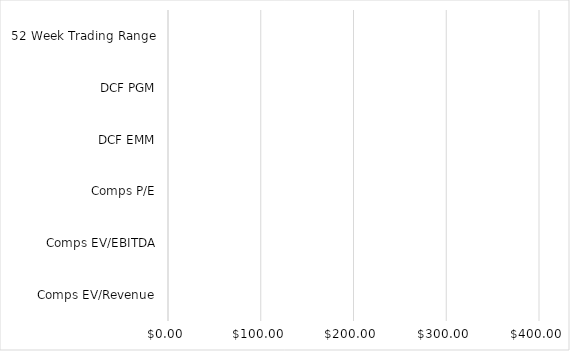
| Category | Min | Difference | Max |
|---|---|---|---|
| Comps EV/Revenue |  | 0 |  |
| Comps EV/EBITDA |  | 0 |  |
| Comps P/E |  | 0 |  |
| DCF EMM |  | 0 |  |
| DCF PGM |  | 0 |  |
| 52 Week Trading Range |  | 0 |  |